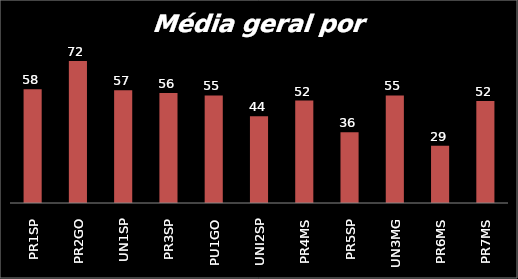
| Category | Series 0 |
|---|---|
| PR1SP | 58 |
| PR2GO | 72.4 |
| UN1SP | 57.4 |
| PR3SP | 56 |
| PU1GO | 54.8 |
| UNI2SP | 44.2 |
| PR4MS | 52.2 |
| PR5SP | 36 |
| UN3MG | 54.8 |
| PR6MS | 29.2 |
| PR7MS | 52 |